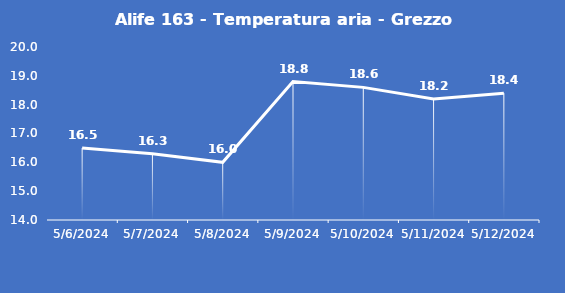
| Category | Alife 163 - Temperatura aria - Grezzo (°C) |
|---|---|
| 5/6/24 | 16.5 |
| 5/7/24 | 16.3 |
| 5/8/24 | 16 |
| 5/9/24 | 18.8 |
| 5/10/24 | 18.6 |
| 5/11/24 | 18.2 |
| 5/12/24 | 18.4 |